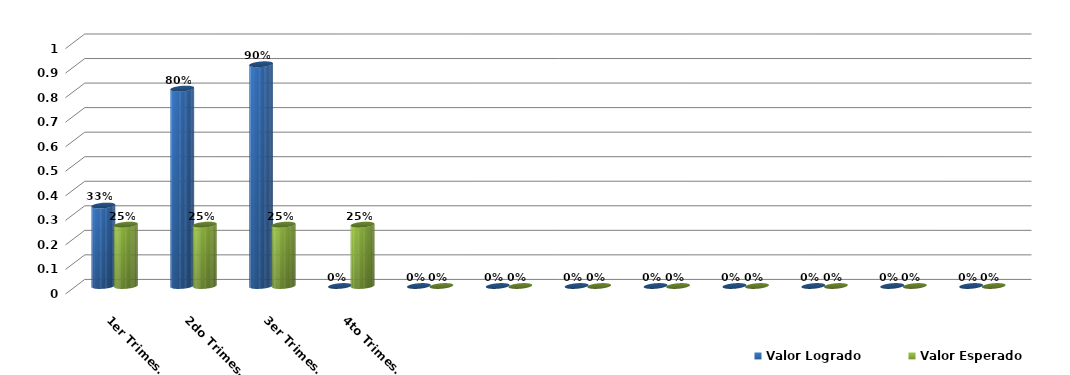
| Category | Valor Logrado | Valor Esperado |
|---|---|---|
| 1er Trimestre | 0.328 | 0.25 |
| 2do Trimestre | 0.804 | 0.25 |
| 3er Trimestre | 0.904 | 0.25 |
| 4to Trimestre | 0 | 0.25 |